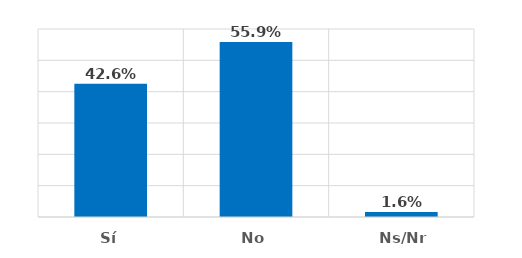
| Category | Series 0 |
|---|---|
| Sí | 0.426 |
| No | 0.559 |
| Ns/Nr | 0.016 |